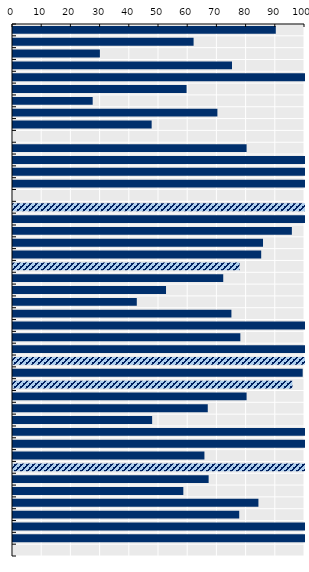
| Category | Payment rate (%) |
|---|---|
| Bulgaria | 90 |
| Greece | 61.845 |
| United Kingdom | 29.759 |
| Slovak Republic | 75 |
| Croatia | 100 |
| Czech Republic | 59.444 |
| Ireland | 27.289 |
| Hungary | 70 |
| New Zealand | 47.485 |
| EU average | 0 |
| Italy | 80 |
| Estonia | 100 |
| Luxembourg | 100 |
| Poland | 100 |
| OECD average | 0 |
| Chile | 100 |
| Colombia | 100 |
| Norway | 95.502 |
| Malta | 85.622 |
| Romania | 85 |
| Lithuania | 77.58 |
| Cyprus | 72 |
| Denmark | 52.405 |
| Australia | 42.396 |
| Finland | 74.8 |
| Costa Rica | 100 |
| Iceland | 77.862 |
| Spain | 100 |
| Austria | 100 |
| Netherlands | 99.206 |
| France | 95.683 |
| Latvia | 80 |
| Turkey | 66.7 |
| Canada | 47.651 |
| Israel | 100 |
| Slovenia | 100 |
| Belgium | 65.559 |
| Germany | 100 |
| Japan | 67 |
| Switzerland | 58.331 |
| Korea | 84.05 |
| Sweden | 77.472 |
| Mexico | 100 |
| Portugal | 100 |
| United States | 0 |